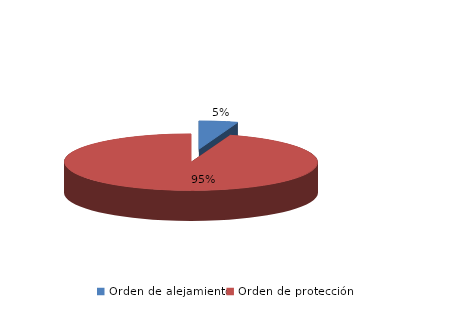
| Category | Series 0 |
|---|---|
| Orden de alejamiento | 34 |
| Orden de protección | 654 |